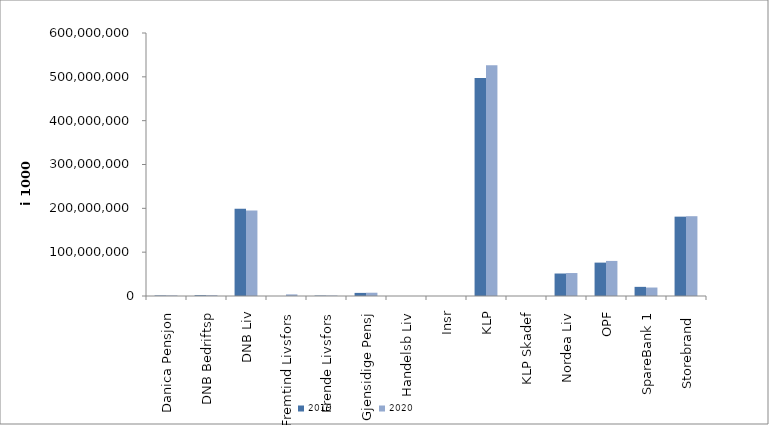
| Category | 2019 | 2020 |
|---|---|---|
| Danica Pensjon | 1147898.651 | 1286357.608 |
| DNB Bedriftsp | 1726673 | 1789003 |
| DNB Liv | 198989780.163 | 194797622 |
| Fremtind Livsfors | 0 | 3675280 |
| Frende Livsfors | 950096 | 1031868 |
| Gjensidige Pensj | 7082534 | 7487655 |
| Handelsb Liv | 28422.661 | 21581.579 |
| Insr | 3921.413 | 0 |
| KLP | 497212120.959 | 526463021.722 |
| KLP Skadef | 34480.175 | 51937.368 |
| Nordea Liv | 51315530 | 52385900 |
| OPF | 76175866 | 80017880 |
| SpareBank 1 | 20850610.601 | 19350549.067 |
| Storebrand  | 181032450.261 | 182050617.751 |